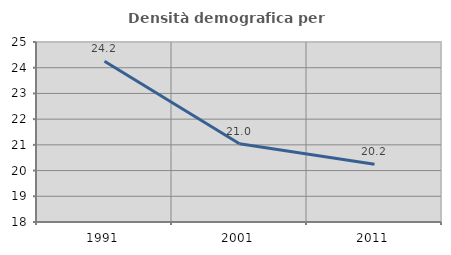
| Category | Densità demografica |
|---|---|
| 1991.0 | 24.249 |
| 2001.0 | 21.045 |
| 2011.0 | 20.244 |